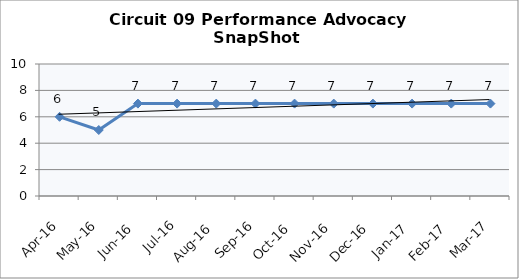
| Category | Circuit 09 |
|---|---|
| Apr-16 | 6 |
| May-16 | 5 |
| Jun-16 | 7 |
| Jul-16 | 7 |
| Aug-16 | 7 |
| Sep-16 | 7 |
| Oct-16 | 7 |
| Nov-16 | 7 |
| Dec-16 | 7 |
| Jan-17 | 7 |
| Feb-17 | 7 |
| Mar-17 | 7 |